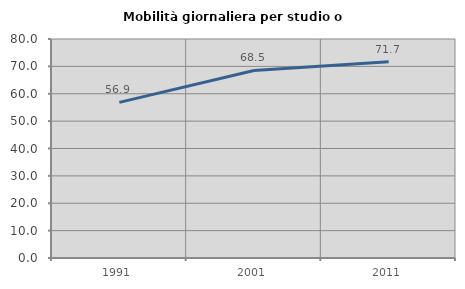
| Category | Mobilità giornaliera per studio o lavoro |
|---|---|
| 1991.0 | 56.856 |
| 2001.0 | 68.513 |
| 2011.0 | 71.716 |